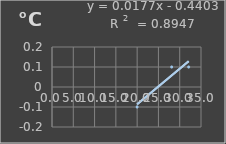
| Category | Temperatura |
|---|---|
| 20.0 | -0.1 |
| 28.1 | 0.1 |
| 32.1 | 0.1 |